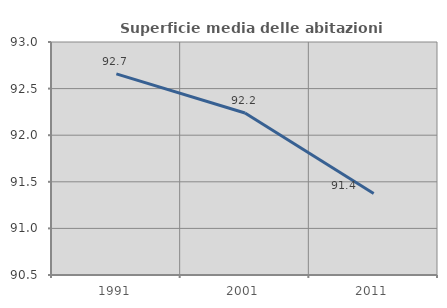
| Category | Superficie media delle abitazioni occupate |
|---|---|
| 1991.0 | 92.658 |
| 2001.0 | 92.238 |
| 2011.0 | 91.373 |